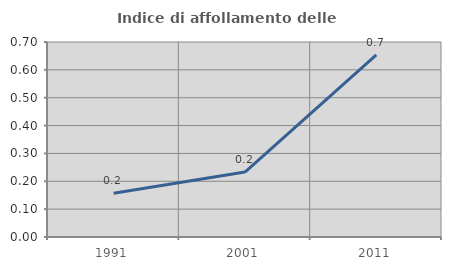
| Category | Indice di affollamento delle abitazioni  |
|---|---|
| 1991.0 | 0.157 |
| 2001.0 | 0.233 |
| 2011.0 | 0.653 |